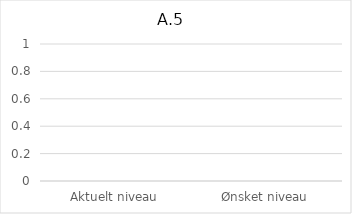
| Category | A.5.1 Retningslinjer for styring af informationssikkerhed |
|---|---|
| Aktuelt niveau | 0 |
| Ønsket niveau | 0 |